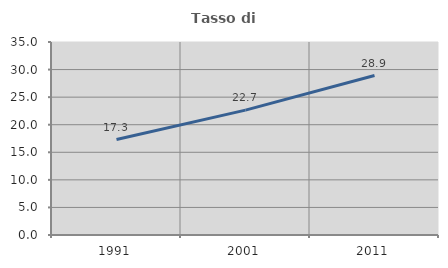
| Category | Tasso di occupazione   |
|---|---|
| 1991.0 | 17.317 |
| 2001.0 | 22.652 |
| 2011.0 | 28.916 |